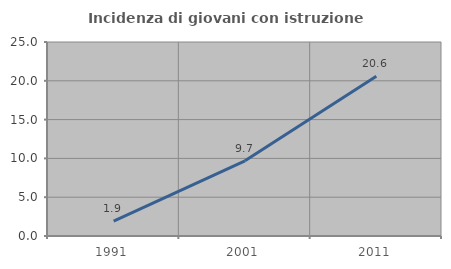
| Category | Incidenza di giovani con istruzione universitaria |
|---|---|
| 1991.0 | 1.916 |
| 2001.0 | 9.689 |
| 2011.0 | 20.601 |